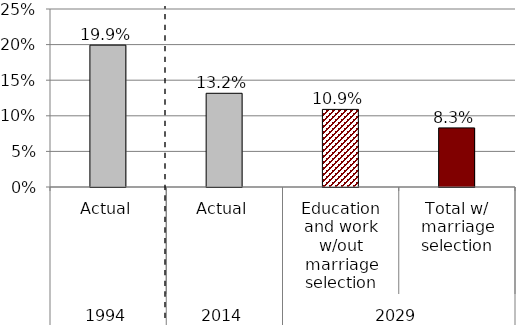
| Category | Series 0 |
|---|---|
| 0 | 0.199 |
| 1 | 0.132 |
| 2 | 0.109 |
| 3 | 0.083 |